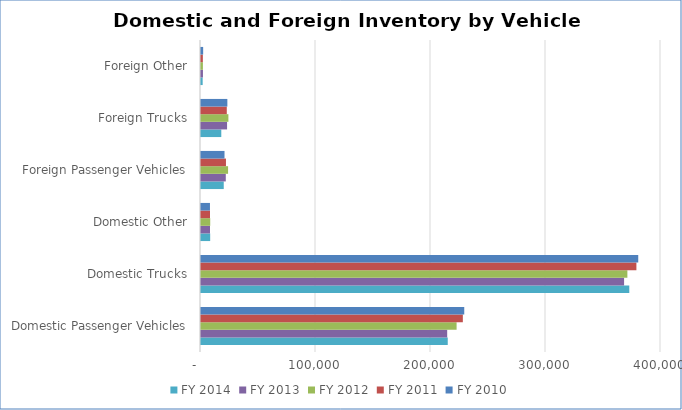
| Category | FY 2014 | FY 2013 | FY 2012 | FY 2011 | FY 2010 |
|---|---|---|---|---|---|
| Domestic Passenger Vehicles | 214562 | 214074 | 222261 | 227689 | 228915 |
| Domestic Trucks | 372435 | 367902 | 370765 | 378612 | 380209 |
| Domestic Other | 7980 | 7851 | 8019 | 7809 | 7789 |
| Foreign Passenger Vehicles | 19776 | 21550 | 23539 | 21708 | 20444 |
| Foreign Trucks | 17647 | 22673 | 23826 | 22426 | 22920 |
| Foreign Other | 1451 | 1698 | 1651 | 1614 | 1877 |